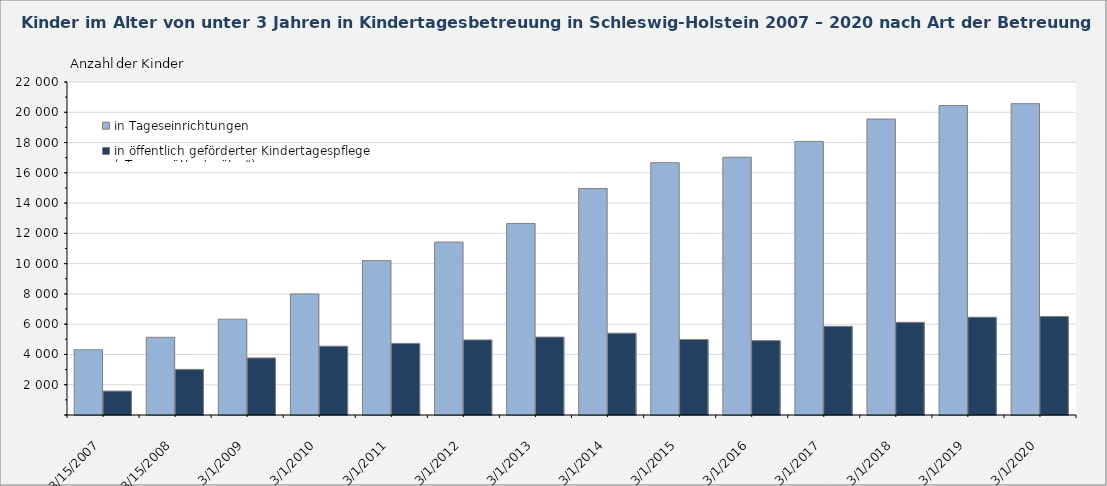
| Category | in Tageseinrichtungen | in öffentlich geförderter Kindertagespflege („Tagesmütter/ -väter“) |
|---|---|---|
| 3/15/07 | 4310 | 1580 |
| 3/15/08 | 5133 | 3013 |
| 3/1/09 | 6329 | 3770 |
| 3/1/10 | 7997 | 4545 |
| 3/1/11 | 10197 | 4731 |
| 3/1/12 | 11425 | 4962 |
| 3/1/13 | 12655 | 5146 |
| 3/1/14 | 14961 | 5405 |
| 3/1/15 | 16670 | 4987 |
| 3/1/16 | 17029 | 4915 |
| 3/1/17 | 18076 | 5857 |
| 3/1/18 | 19553 | 6125 |
| 3/1/19 | 20448 | 6461 |
| 3/1/20 | 20569 | 6509 |